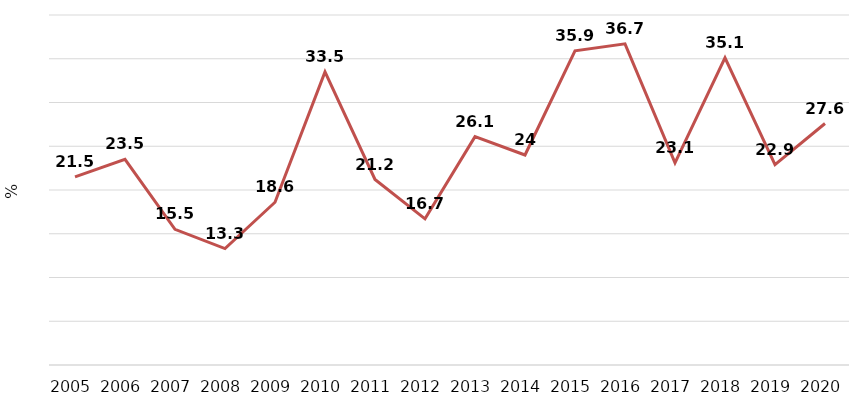
| Category | Series 0 |
|---|---|
| 2005 | 21.5 |
| 2006 | 23.5 |
| 2007 | 15.5 |
| 2008 | 13.3 |
| 2009 | 18.6 |
| 2010 | 33.5 |
| 2011 | 21.2 |
| 2012 | 16.7 |
| 2013 | 26.1 |
| 2014 | 24 |
| 2015 | 35.9 |
| 2016 | 36.7 |
| 2017 | 23.1 |
| 2018 | 35.1 |
| 2019 | 22.9 |
| 2020 | 27.6 |